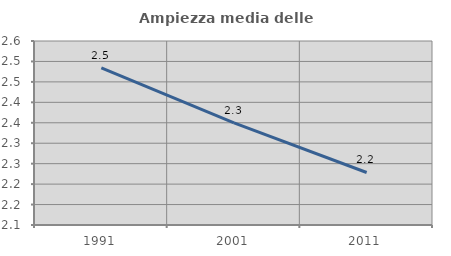
| Category | Ampiezza media delle famiglie |
|---|---|
| 1991.0 | 2.484 |
| 2001.0 | 2.35 |
| 2011.0 | 2.228 |